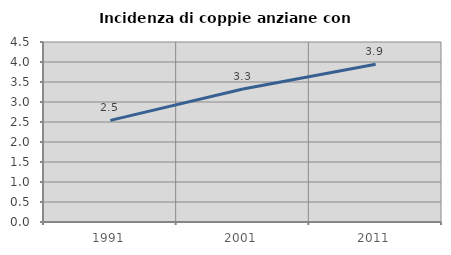
| Category | Incidenza di coppie anziane con figli |
|---|---|
| 1991.0 | 2.541 |
| 2001.0 | 3.327 |
| 2011.0 | 3.945 |